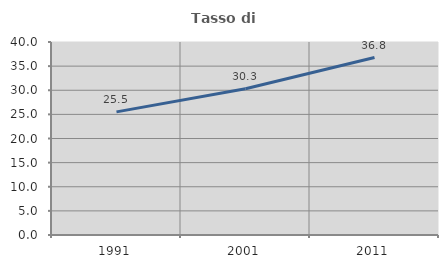
| Category | Tasso di occupazione   |
|---|---|
| 1991.0 | 25.519 |
| 2001.0 | 30.303 |
| 2011.0 | 36.775 |